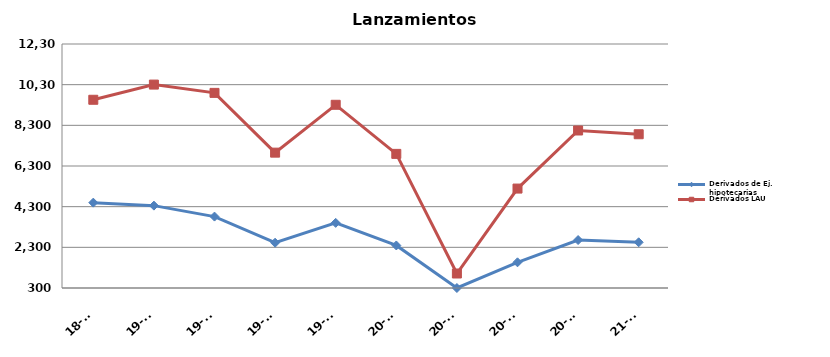
| Category | Derivados de Ej. hipotecarias | Derivados LAU |
|---|---|---|
| 18-T4 | 4498 | 9557 |
| 19-T1 | 4351 | 10304 |
| 19-T2 | 3812 | 9896 |
| 19-T3 | 2527 | 6957 |
| 19-T4 | 3503 | 9310 |
| 20-T1 | 2392 | 6896 |
| 20-T2 | 300 | 1013 |
| 20-T3 | 1564 | 5190 |
| 20-T4 | 2659 | 8046 |
| 21-T1 | 2548 | 7862 |